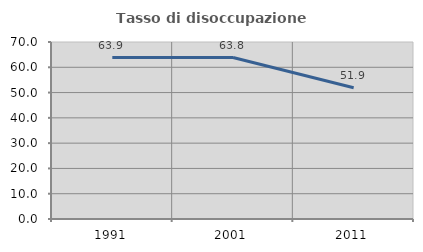
| Category | Tasso di disoccupazione giovanile  |
|---|---|
| 1991.0 | 63.868 |
| 2001.0 | 63.848 |
| 2011.0 | 51.929 |